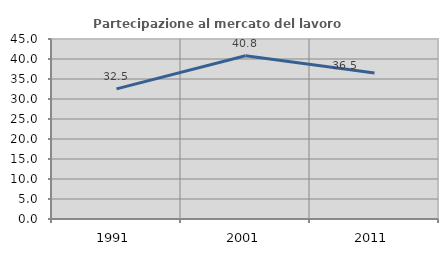
| Category | Partecipazione al mercato del lavoro  femminile |
|---|---|
| 1991.0 | 32.536 |
| 2001.0 | 40.826 |
| 2011.0 | 36.516 |